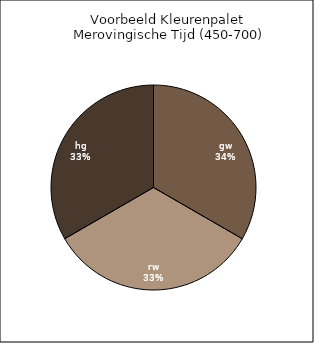
| Category | Series 0 |
|---|---|
| gw | 1 |
| rw | 1 |
| hg | 1 |